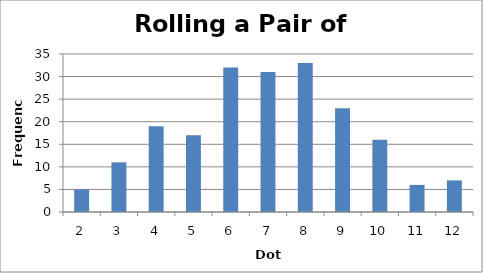
| Category | Series 0 |
|---|---|
| 2.0 | 5 |
| 3.0 | 11 |
| 4.0 | 19 |
| 5.0 | 17 |
| 6.0 | 32 |
| 7.0 | 31 |
| 8.0 | 33 |
| 9.0 | 23 |
| 10.0 | 16 |
| 11.0 | 6 |
| 12.0 | 7 |